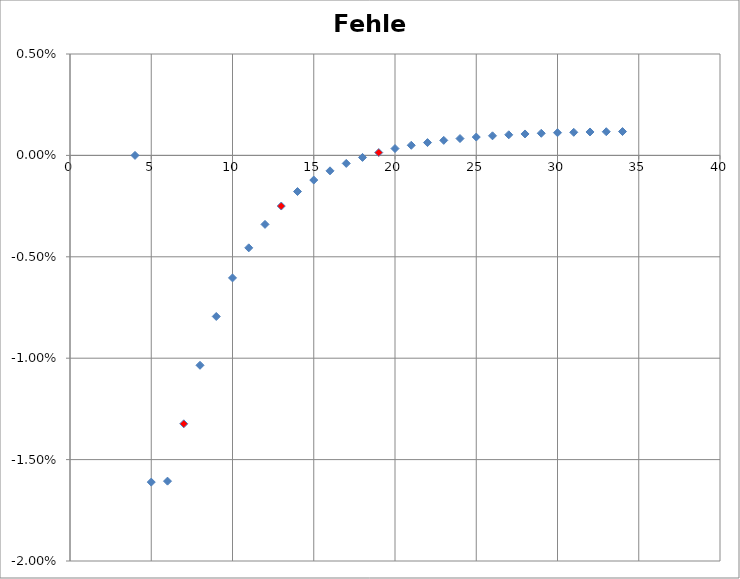
| Category | Fehler |
|---|---|
| 4.0 | 0 |
| 5.0 | -0.016 |
| 6.0 | -0.016 |
| 7.0 | -0.013 |
| 8.0 | -0.01 |
| 9.0 | -0.008 |
| 10.0 | -0.006 |
| 11.0 | -0.005 |
| 12.0 | -0.003 |
| 13.0 | -0.002 |
| 14.0 | -0.002 |
| 15.0 | -0.001 |
| 16.0 | -0.001 |
| 17.0 | 0 |
| 18.0 | 0 |
| 19.0 | 0 |
| 20.0 | 0 |
| 21.0 | 0 |
| 22.0 | 0.001 |
| 23.0 | 0.001 |
| 24.0 | 0.001 |
| 25.0 | 0.001 |
| 26.0 | 0.001 |
| 27.0 | 0.001 |
| 28.0 | 0.001 |
| 29.0 | 0.001 |
| 30.0 | 0.001 |
| 31.0 | 0.001 |
| 32.0 | 0.001 |
| 33.0 | 0.001 |
| 34.0 | 0.001 |